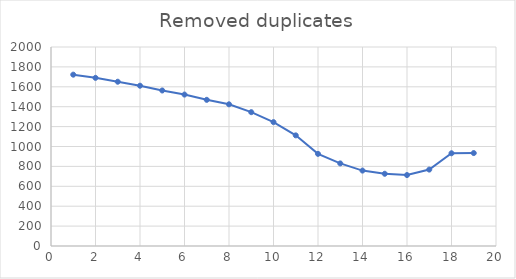
| Category | Series 0 |
|---|---|
| 0 | 1722 |
| 1 | 1690 |
| 2 | 1651 |
| 3 | 1611 |
| 4 | 1563 |
| 5 | 1522 |
| 6 | 1469 |
| 7 | 1424 |
| 8 | 1345 |
| 9 | 1245 |
| 10 | 1112 |
| 11 | 926 |
| 12 | 830 |
| 13 | 758 |
| 14 | 726 |
| 15 | 713 |
| 16 | 768 |
| 17 | 932 |
| 18 | 934 |